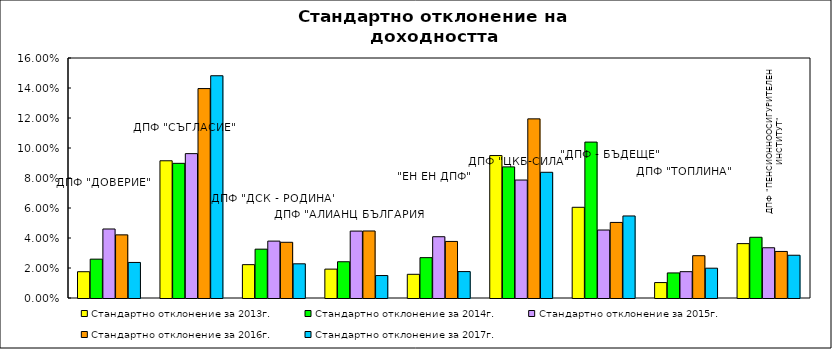
| Category | Стандартно отклонение за 2013г. | Стандартно отклонение за 2014г. | Стандартно отклонение за 2015г. | Стандартно отклонение за 2016г. | Стандартно отклонение за 2017г. |
|---|---|---|---|---|---|
| ДПФ "ДОВЕРИЕ"  | 0.018 | 0.026 | 0.046 | 0.042 | 0.024 |
| ДПФ "СЪГЛАСИЕ"  | 0.091 | 0.09 | 0.096 | 0.14 | 0.148 |
| ДПФ "ДСК - РОДИНА" | 0.022 | 0.033 | 0.038 | 0.037 | 0.023 |
| ДПФ "АЛИАНЦ БЪЛГАРИЯ" | 0.019 | 0.024 | 0.045 | 0.045 | 0.015 |
| "ЕН ЕН ДПФ" | 0.016 | 0.027 | 0.041 | 0.038 | 0.018 |
| ДПФ "ЦКБ-СИЛА" | 0.095 | 0.087 | 0.079 | 0.119 | 0.084 |
| "ДПФ - БЪДЕЩЕ" | 0.06 | 0.104 | 0.045 | 0.05 | 0.055 |
| ДПФ "ТОПЛИНА" | 0.01 | 0.017 | 0.018 | 0.028 | 0.02 |
| ДПФ "ПЕНСИОННООСИГУРИТЕЛЕН ИНСТИТУТ" | 0.036 | 0.04 | 0.033 | 0.031 | 0.029 |